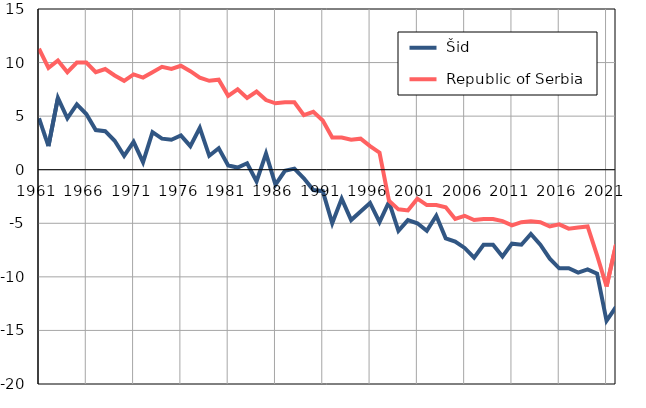
| Category |  Šid |  Republic of Serbia |
|---|---|---|
| 1961.0 | 4.8 | 11.3 |
| 1962.0 | 2.2 | 9.5 |
| 1963.0 | 6.7 | 10.2 |
| 1964.0 | 4.8 | 9.1 |
| 1965.0 | 6.1 | 10 |
| 1966.0 | 5.2 | 10 |
| 1967.0 | 3.7 | 9.1 |
| 1968.0 | 3.6 | 9.4 |
| 1969.0 | 2.7 | 8.8 |
| 1970.0 | 1.3 | 8.3 |
| 1971.0 | 2.6 | 8.9 |
| 1972.0 | 0.7 | 8.6 |
| 1973.0 | 3.5 | 9.1 |
| 1974.0 | 2.9 | 9.6 |
| 1975.0 | 2.8 | 9.4 |
| 1976.0 | 3.2 | 9.7 |
| 1977.0 | 2.2 | 9.2 |
| 1978.0 | 3.9 | 8.6 |
| 1979.0 | 1.3 | 8.3 |
| 1980.0 | 2 | 8.4 |
| 1981.0 | 0.4 | 6.9 |
| 1982.0 | 0.2 | 7.5 |
| 1983.0 | 0.6 | 6.7 |
| 1984.0 | -1.1 | 7.3 |
| 1985.0 | 1.5 | 6.5 |
| 1986.0 | -1.4 | 6.2 |
| 1987.0 | -0.1 | 6.3 |
| 1988.0 | 0.1 | 6.3 |
| 1989.0 | -0.8 | 5.1 |
| 1990.0 | -1.9 | 5.4 |
| 1991.0 | -2 | 4.6 |
| 1992.0 | -5 | 3 |
| 1993.0 | -2.7 | 3 |
| 1994.0 | -4.7 | 2.8 |
| 1995.0 | -3.9 | 2.9 |
| 1996.0 | -3.1 | 2.2 |
| 1997.0 | -4.9 | 1.6 |
| 1998.0 | -3 | -2.9 |
| 1999.0 | -5.7 | -3.7 |
| 2000.0 | -4.7 | -3.8 |
| 2001.0 | -5 | -2.7 |
| 2002.0 | -5.7 | -3.3 |
| 2003.0 | -4.3 | -3.3 |
| 2004.0 | -6.4 | -3.5 |
| 2005.0 | -6.7 | -4.6 |
| 2006.0 | -7.3 | -4.3 |
| 2007.0 | -8.2 | -4.7 |
| 2008.0 | -7 | -4.6 |
| 2009.0 | -7 | -4.6 |
| 2010.0 | -8.1 | -4.8 |
| 2011.0 | -6.9 | -5.2 |
| 2012.0 | -7 | -4.9 |
| 2013.0 | -6 | -4.8 |
| 2014.0 | -7 | -4.9 |
| 2015.0 | -8.3 | -5.3 |
| 2016.0 | -9.2 | -5.1 |
| 2017.0 | -9.2 | -5.5 |
| 2018.0 | -9.6 | -5.4 |
| 2019.0 | -9.3 | -5.3 |
| 2020.0 | -9.7 | -8 |
| 2021.0 | -14.1 | -10.9 |
| 2022.0 | -12.8 | -7 |